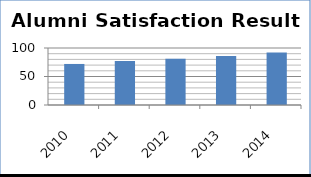
| Category | Alumni Satisfaction Results |
|---|---|
| 2010.0 | 72 |
| 2011.0 | 77 |
| 2012.0 | 81 |
| 2013.0 | 86 |
| 2014.0 | 92 |